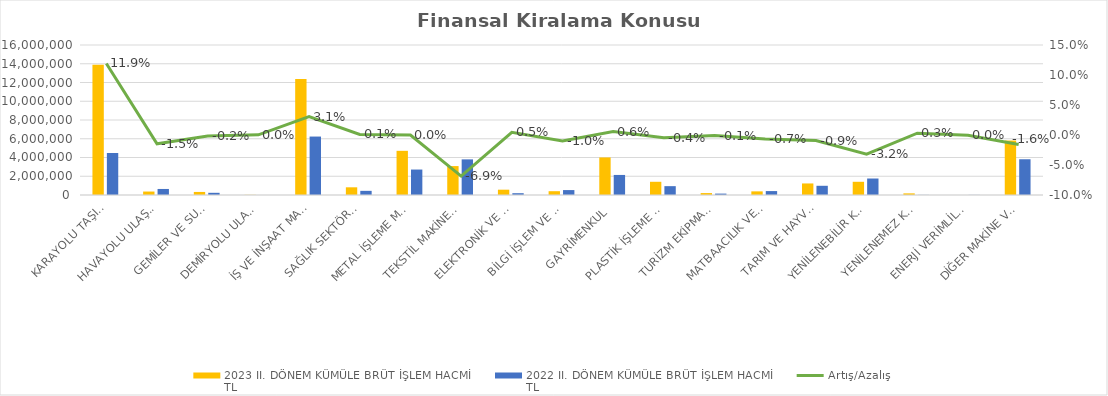
| Category | 2023 II. DÖNEM KÜMÜLE BRÜT İŞLEM HACMİ 
TL | 2022 II. DÖNEM KÜMÜLE BRÜT İŞLEM HACMİ 
TL |
|---|---|---|
| KARAYOLU TAŞITLARI | 13880976.351 | 4481193.914 |
| HAVAYOLU ULAŞIM ARAÇLARI | 368868.879 | 643885 |
| GEMİLER VE SUDA YÜZEN TAŞIT VE ARAÇLAR | 325971.523 | 233742.45 |
| DEMİRYOLU ULAŞIM ARAÇLARI | 15840 | 0 |
| İŞ VE İNŞAAT MAKİNELERİ | 12383311.331 | 6234107.619 |
| SAĞLIK SEKTÖRÜ VE ESTETİK EKİPMANLARI | 820107.098 | 443301.291 |
| METAL İŞLEME MAKİNELERİ | 4711800.163 | 2715534.944 |
| TEKSTİL MAKİNELERİ | 3085366.815 | 3799704.912 |
| ELEKTRONİK VE OPTİK CİHAZLAR | 566538.722 | 191675.012 |
| BİLGİ İŞLEM VE BÜRO SİSTEMLERİ | 405577.067 | 524994.362 |
| GAYRİMENKUL | 4005896.527 | 2139214.991 |
| PLASTİK İŞLEME MAKİNELERİ | 1409970.548 | 943798.476 |
| TURİZM EKİPMANLARI | 205311.661 | 148371.059 |
| MATBAACILIK VE KAĞIT İŞLEME MAKİNELERİ | 387180.612 | 418984.242 |
| TARIM VE HAYVANCILIK MAKİNELERİ | 1232295.552 | 982892.781 |
| YENİLENEBİLİR KAYNAKLI ELEKTRİK ENERJİSİ ÜRETİM EKİPMANLARI | 1409622.31 | 1758627.274 |
| YENİLENEMEZ KAYNAKLI ELEKTRİK ENERJİSİ ÜRETİM EKİPMANLARI | 173247 | 11337 |
| ENERJİ VERİMLİLİĞİ EKİPMANLARI | 0 | 11273.342 |
| DİĞER MAKİNE VE EKİPMANLAR | 5808894.556 | 3812181.107 |